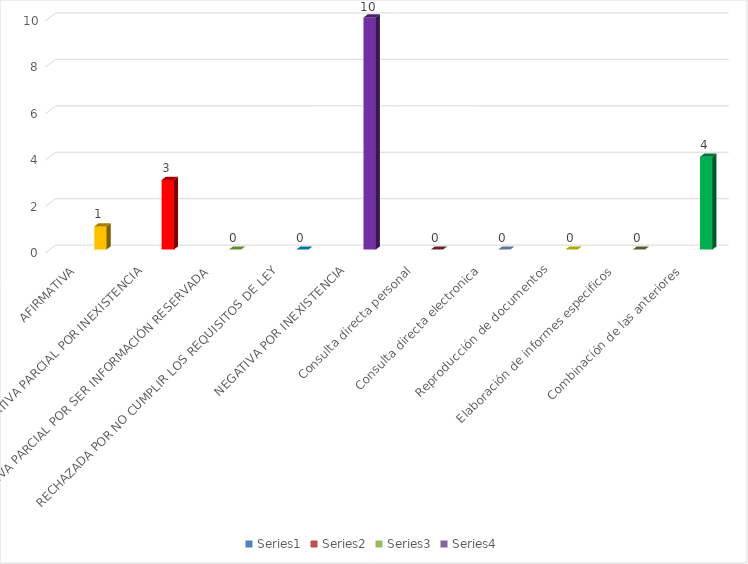
| Category | Series 0 | Series 1 | Series 2 | Series 3 |
|---|---|---|---|---|
| AFIRMATIVA |  |  |  | 1 |
| AFIRMATIVA PARCIAL POR INEXISTENCIA |  |  |  | 3 |
| AFIRMATIVA PARCIAL POR SER INFORMACIÓN RESERVADA |  |  |  | 0 |
| RECHAZADA POR NO CUMPLIR LOS REQUISITOS DE LEY |  |  |  | 0 |
| NEGATIVA POR INEXISTENCIA |  |  |  | 10 |
| Consulta directa personal |  |  |  | 0 |
| Consulta directa electronica |  |  |  | 0 |
| Reproducción de documentos |  |  |  | 0 |
| Elaboración de informes especificos |  |  |  | 0 |
| Combinación de las anteriores |  |  |  | 4 |